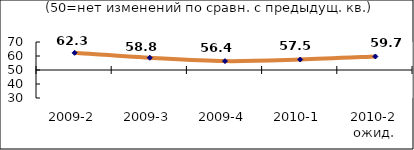
| Category | Диф.индекс ↓ |
|---|---|
| 2009-2 | 62.255 |
| 2009-3 | 58.75 |
| 2009-4 | 56.36 |
| 2010-1 | 57.475 |
| 2010-2 ожид. | 59.665 |